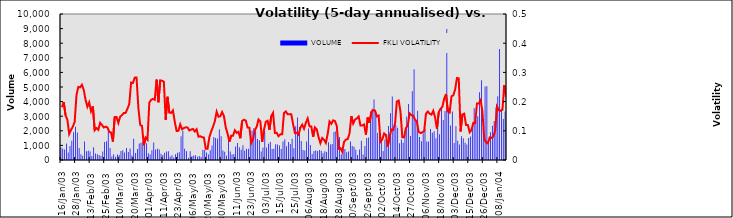
| Category | VOLUME |
|---|---|
| 2003-01-16 | 860 |
| 2003-01-17 | 786 |
| 2003-01-20 | 711 |
| 2003-01-21 | 1124 |
| 2003-01-22 | 519 |
| 2003-01-23 | 961 |
| 2003-01-24 | 1317 |
| 2003-01-27 | 1909 |
| 2003-01-28 | 2274 |
| 2003-01-29 | 1876 |
| 2003-01-30 | 814 |
| 2003-02-05 | 387 |
| 2003-02-06 | 289 |
| 2003-02-07 | 1270 |
| 2003-02-10 | 597 |
| 2003-02-11 | 648 |
| 2003-02-13 | 585 |
| 2003-02-14 | 279 |
| 2003-02-17 | 871 |
| 2003-02-18 | 443 |
| 2003-02-19 | 394 |
| 2003-02-20 | 337 |
| 2003-02-21 | 273 |
| 2003-02-24 | 582 |
| 2003-02-25 | 1228 |
| 2003-02-26 | 1290 |
| 2003-02-27 | 2004 |
| 2003-02-28 | 819 |
| 2003-03-03 | 236 |
| 2003-03-05 | 389 |
| 2003-03-06 | 221 |
| 2003-03-07 | 376 |
| 2003-03-10 | 339 |
| 2003-03-11 | 620 |
| 2003-03-12 | 662 |
| 2003-03-13 | 519 |
| 2003-03-14 | 819 |
| 2003-03-17 | 548 |
| 2003-03-18 | 791 |
| 2003-03-19 | 304 |
| 2003-03-20 | 1456 |
| 2003-03-21 | 474 |
| 2003-03-24 | 748 |
| 2003-03-25 | 1135 |
| 2003-03-26 | 1189 |
| 2003-03-27 | 1266 |
| 2003-03-28 | 1488 |
| 2003-03-31 | 1140 |
| 2003-04-01 | 457 |
| 2003-04-02 | 374 |
| 2003-04-03 | 675 |
| 2003-04-04 | 1195 |
| 2003-04-07 | 727 |
| 2003-04-08 | 770 |
| 2003-04-09 | 712 |
| 2003-04-10 | 424 |
| 2003-04-11 | 341 |
| 2003-04-14 | 498 |
| 2003-04-15 | 587 |
| 2003-04-16 | 595 |
| 2003-04-17 | 248 |
| 2003-04-18 | 328 |
| 2003-04-21 | 167 |
| 2003-04-22 | 401 |
| 2003-04-23 | 493 |
| 2003-04-24 | 523 |
| 2003-04-25 | 1621 |
| 2003-04-28 | 1996 |
| 2003-04-29 | 770 |
| 2003-04-30 | 591 |
| 2003-05-02 | 148 |
| 2003-05-05 | 592 |
| 2003-05-06 | 250 |
| 2003-05-07 | 307 |
| 2003-05-08 | 318 |
| 2003-05-09 | 225 |
| 2003-05-12 | 275 |
| 2003-05-13 | 208 |
| 2003-05-16 | 699 |
| 2003-05-19 | 692 |
| 2003-05-20 | 506 |
| 2003-05-21 | 369 |
| 2003-05-22 | 663 |
| 2003-05-23 | 991 |
| 2003-05-26 | 1583 |
| 2003-05-27 | 1504 |
| 2003-05-28 | 1466 |
| 2003-05-29 | 2091 |
| 2003-05-30 | 1634 |
| 2003-06-02 | 654 |
| 2003-06-03 | 568 |
| 2003-06-04 | 286 |
| 2003-06-05 | 1412 |
| 2003-06-06 | 576 |
| 2003-06-09 | 379 |
| 2003-06-10 | 416 |
| 2003-06-11 | 926 |
| 2003-06-12 | 1169 |
| 2003-06-13 | 880 |
| 2003-06-16 | 705 |
| 2003-06-17 | 1016 |
| 2003-06-18 | 656 |
| 2003-06-19 | 764 |
| 2003-06-20 | 766 |
| 2003-06-23 | 1603 |
| 2003-06-24 | 2020 |
| 2003-06-25 | 2196 |
| 2003-06-26 | 1965 |
| 2003-06-27 | 1445 |
| 2003-06-30 | 1348 |
| 2003-07-01 | 589 |
| 2003-07-02 | 849 |
| 2003-07-03 | 1931 |
| 2003-07-04 | 856 |
| 2003-07-07 | 1110 |
| 2003-07-08 | 1231 |
| 2003-07-09 | 760 |
| 2003-07-10 | 771 |
| 2003-07-11 | 1073 |
| 2003-07-14 | 1064 |
| 2003-07-15 | 985 |
| 2003-07-16 | 759 |
| 2003-07-17 | 1275 |
| 2003-07-18 | 1413 |
| 2003-07-21 | 950 |
| 2003-07-22 | 1227 |
| 2003-07-23 | 1093 |
| 2003-07-24 | 1461 |
| 2003-07-25 | 813 |
| 2003-07-28 | 2318 |
| 2003-07-29 | 2908 |
| 2003-07-30 | 2265 |
| 2003-07-31 | 1306 |
| 2003-08-01 | 686 |
| 2003-08-04 | 651 |
| 2003-08-05 | 1273 |
| 2003-08-06 | 2160 |
| 2003-08-07 | 1020 |
| 2003-08-08 | 406 |
| 2003-08-11 | 622 |
| 2003-08-12 | 659 |
| 2003-08-13 | 617 |
| 2003-08-14 | 685 |
| 2003-08-15 | 641 |
| 2003-08-18 | 466 |
| 2003-08-19 | 600 |
| 2003-08-20 | 553 |
| 2003-08-21 | 1222 |
| 2003-08-22 | 1060 |
| 2003-08-25 | 1092 |
| 2003-08-26 | 1916 |
| 2003-08-27 | 1975 |
| 2003-08-28 | 1687 |
| 2003-08-29 | 1569 |
| 2003-09-02 | 400 |
| 2003-09-03 | 761 |
| 2003-09-04 | 752 |
| 2003-09-05 | 535 |
| 2003-09-08 | 579 |
| 2003-09-09 | 1261 |
| 2003-09-10 | 953 |
| 2003-09-11 | 912 |
| 2003-09-12 | 696 |
| 2003-09-15 | 337 |
| 2003-09-16 | 717 |
| 2003-09-17 | 1318 |
| 2003-09-18 | 384 |
| 2003-09-19 | 959 |
| 2003-09-22 | 1503 |
| 2003-09-23 | 1544 |
| 2003-09-24 | 3215 |
| 2003-09-25 | 3514 |
| 2003-09-26 | 4146 |
| 2003-09-29 | 3272 |
| 2003-09-30 | 1847 |
| 2003-10-01 | 1734 |
| 2003-10-02 | 1412 |
| 2003-10-03 | 620 |
| 2003-10-06 | 1410 |
| 2003-10-07 | 1785 |
| 2003-10-08 | 2331 |
| 2003-10-09 | 3202 |
| 2003-10-10 | 4356 |
| 2003-10-13 | 2135 |
| 2003-10-14 | 2397 |
| 2003-10-15 | 2215 |
| 2003-10-16 | 1155 |
| 2003-10-17 | 1408 |
| 2003-10-20 | 1180 |
| 2003-10-21 | 1978 |
| 2003-10-22 | 2985 |
| 2003-10-23 | 3841 |
| 2003-10-27 | 1641 |
| 2003-10-28 | 4717 |
| 2003-10-29 | 6208 |
| 2003-10-30 | 2787 |
| 2003-10-31 | 3365 |
| 2003-11-03 | 1583 |
| 2003-11-04 | 1278 |
| 2003-11-05 | 1835 |
| 2003-11-06 | 2118 |
| 2003-11-07 | 1262 |
| 2003-11-10 | 1272 |
| 2003-11-11 | 2129 |
| 2003-11-12 | 1863 |
| 2003-11-13 | 1965 |
| 2003-11-14 | 1483 |
| 2003-11-17 | 2717 |
| 2003-11-18 | 1769 |
| 2003-11-19 | 3640 |
| 2003-11-20 | 2735 |
| 2003-11-21 | 3358 |
| 2003-11-27 | 8967 |
| 2003-11-28 | 3576 |
| 2003-12-01 | 2371 |
| 2003-12-02 | 3327 |
| 2003-12-03 | 1158 |
| 2003-12-04 | 2317 |
| 2003-12-05 | 1311 |
| 2003-12-08 | 1056 |
| 2003-12-09 | 1633 |
| 2003-12-10 | 1497 |
| 2003-12-11 | 1177 |
| 2003-12-12 | 1062 |
| 2003-12-15 | 1512 |
| 2003-12-16 | 1606 |
| 2003-12-17 | 2504 |
| 2003-12-18 | 3546 |
| 2003-12-19 | 2705 |
| 2003-12-22 | 2994 |
| 2003-12-23 | 4642 |
| 2003-12-24 | 5455 |
| 2003-12-26 | 2109 |
| 2003-12-29 | 5034 |
| 2003-12-30 | 5044 |
| 2003-12-31 | 1159 |
| 2004-01-02 | 1907 |
| 2004-01-05 | 2348 |
| 2004-01-06 | 2675 |
| 2004-01-07 | 3596 |
| 2004-01-08 | 4363 |
| 2004-01-09 | 7596 |
| 2004-01-12 | 3451 |
| 2004-01-13 | 2800 |
| 2004-01-14 | 3324 |